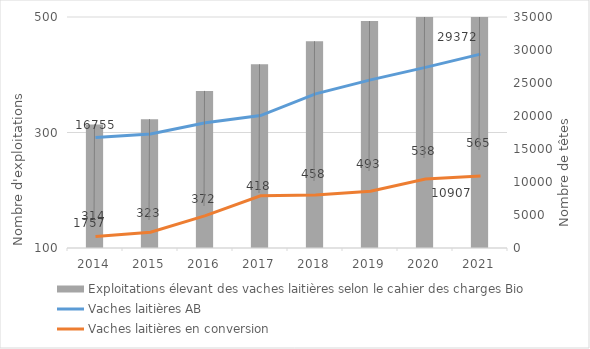
| Category | Exploitations élevant des vaches laitières selon le cahier des charges Bio |
|---|---|
| 2014.0 | 314 |
| 2015.0 | 323 |
| 2016.0 | 372 |
| 2017.0 | 418 |
| 2018.0 | 458 |
| 2019.0 | 493 |
| 2020.0 | 538 |
| 2021.0 | 565 |